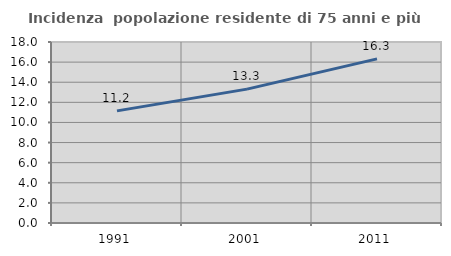
| Category | Incidenza  popolazione residente di 75 anni e più |
|---|---|
| 1991.0 | 11.152 |
| 2001.0 | 13.312 |
| 2011.0 | 16.318 |